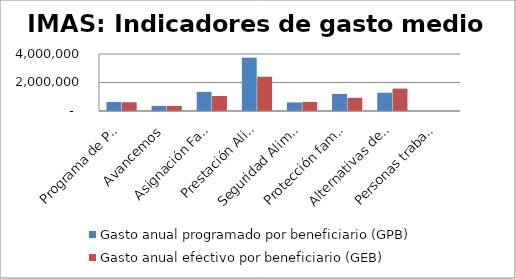
| Category | Gasto anual programado por beneficiario (GPB)  | Gasto anual efectivo por beneficiario (GEB)  |
|---|---|---|
| Programa de Promoción y Protección Social | 638988.308 | 614516.715 |
| Avancemos | 360000 | 355962.527 |
| Asignación Familiar | 1344000 | 1053502.385 |
| Prestación Alimentaria | 3744000 | 2408291.845 |
| Seguridad Alimentaria | 600000 | 636617.296 |
| Protección familiar | 1200000 | 925253.451 |
| Alternativas de Cuido | 1284000 | 1571561.973 |
| Personas trabajadores menores de edad | 0 | 0 |